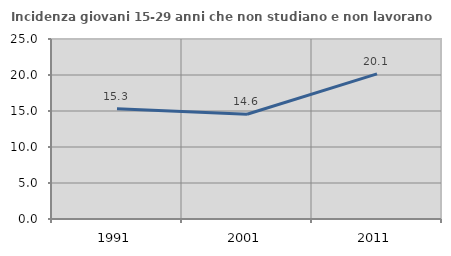
| Category | Incidenza giovani 15-29 anni che non studiano e non lavorano  |
|---|---|
| 1991.0 | 15.323 |
| 2001.0 | 14.553 |
| 2011.0 | 20.147 |